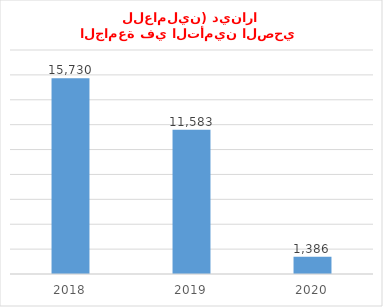
| Category | ديون متراكمة في بند (مساهمة الجامعة في التأمين الصحي للعاملين) دينارا |
|---|---|
| 2018.0 | 15730 |
| 2019.0 | 11583 |
| 2020.0 | 1386 |